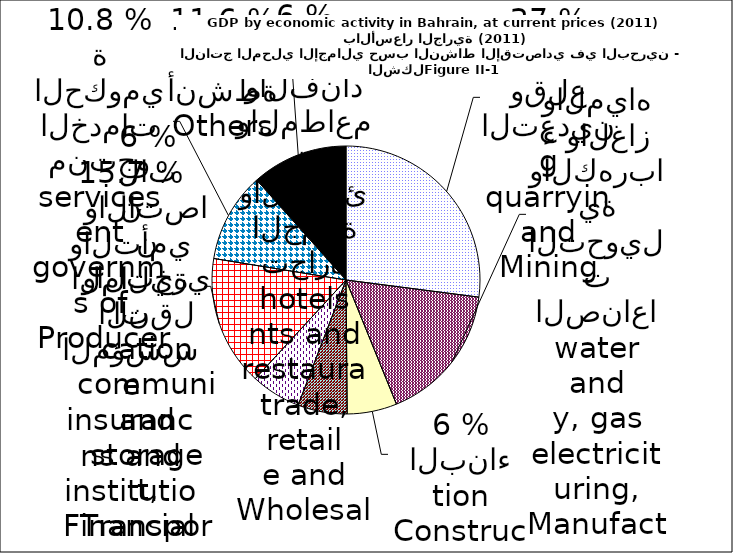
| Category | Series 0 |
|---|---|
| Mining and quarrying | 2947.874 |
| Manufacturing, electricity, gas and water | 1832.945 |
| Construction | 653.979 |
| Wholesale and retail trade, restaurants and hotels | 649.303 |
| Transport, storage and communication | 656.33 |
| Financial institutions and insurance | 1714.971 |
|  Producers of government services | 1180.175 |
| Others | 1265.07 |